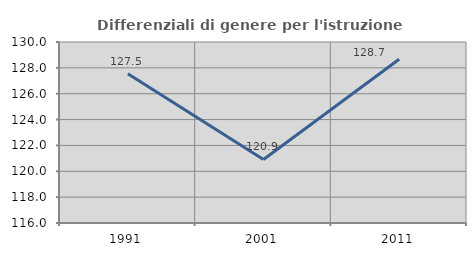
| Category | Differenziali di genere per l'istruzione superiore |
|---|---|
| 1991.0 | 127.546 |
| 2001.0 | 120.913 |
| 2011.0 | 128.66 |